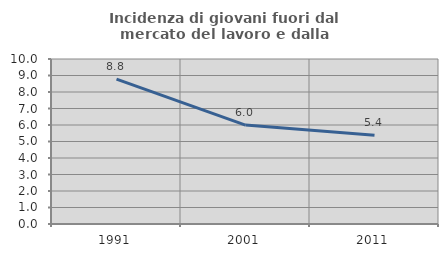
| Category | Incidenza di giovani fuori dal mercato del lavoro e dalla formazione  |
|---|---|
| 1991.0 | 8.782 |
| 2001.0 | 5.994 |
| 2011.0 | 5.386 |